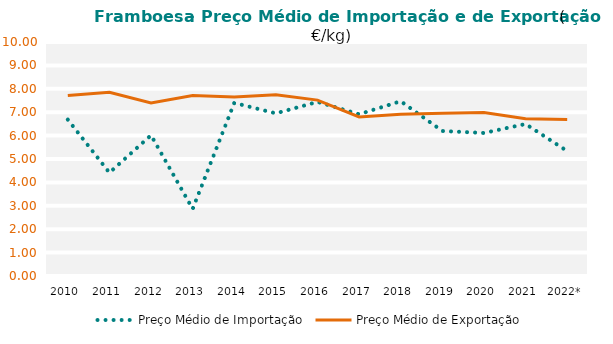
| Category | Preço Médio de Importação | Preço Médio de Exportação |
|---|---|---|
| 2010 | 6.684 | 7.715 |
| 2011 | 4.414 | 7.852 |
| 2012 | 6.016 | 7.392 |
| 2013 | 2.868 | 7.714 |
| 2014 | 7.396 | 7.649 |
| 2015 | 6.951 | 7.745 |
| 2016 | 7.441 | 7.516 |
| 2017 | 6.913 | 6.798 |
| 2018 | 7.468 | 6.917 |
| 2019 | 6.197 | 6.951 |
| 2020 | 6.112 | 6.988 |
| 2021 | 6.495 | 6.72 |
| 2022* | 5.338 | 6.689 |